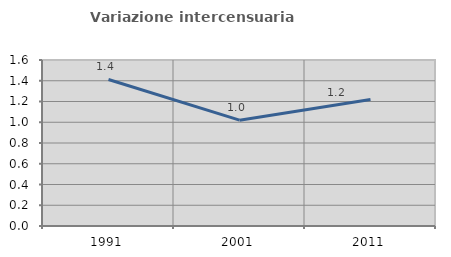
| Category | Variazione intercensuaria annua |
|---|---|
| 1991.0 | 1.412 |
| 2001.0 | 1.02 |
| 2011.0 | 1.219 |